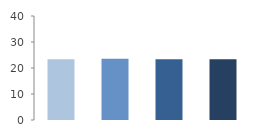
| Category | Rate (%) |
|---|---|
| 2009.0 | 23.349 |
| 2010.0 | 23.519 |
| 2011.0 | 23.357 |
| 2012.0 | 23.393 |